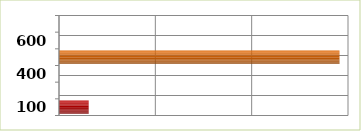
| Category | Series 0 |
|---|---|
| 100.0 | 3079173 |
| 200.0 | 0 |
| 400.0 | 0 |
| 500.0 | 29115355 |
| 600.0 | 7520 |
| 700.0 | 0 |